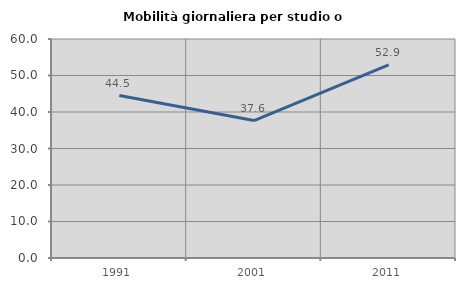
| Category | Mobilità giornaliera per studio o lavoro |
|---|---|
| 1991.0 | 44.509 |
| 2001.0 | 37.647 |
| 2011.0 | 52.889 |